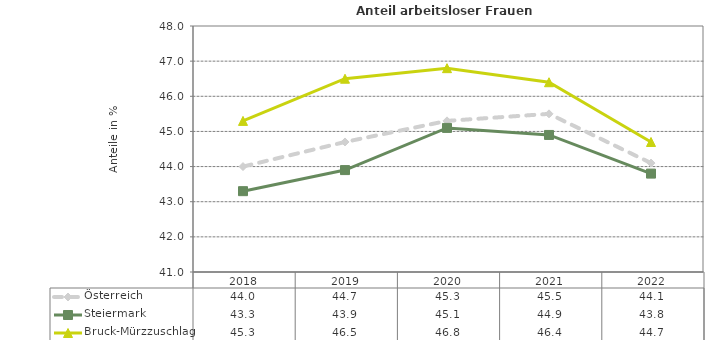
| Category | Österreich | Steiermark | Bruck-Mürzzuschlag |
|---|---|---|---|
| 2022.0 | 44.1 | 43.8 | 44.7 |
| 2021.0 | 45.5 | 44.9 | 46.4 |
| 2020.0 | 45.3 | 45.1 | 46.8 |
| 2019.0 | 44.7 | 43.9 | 46.5 |
| 2018.0 | 44 | 43.3 | 45.3 |